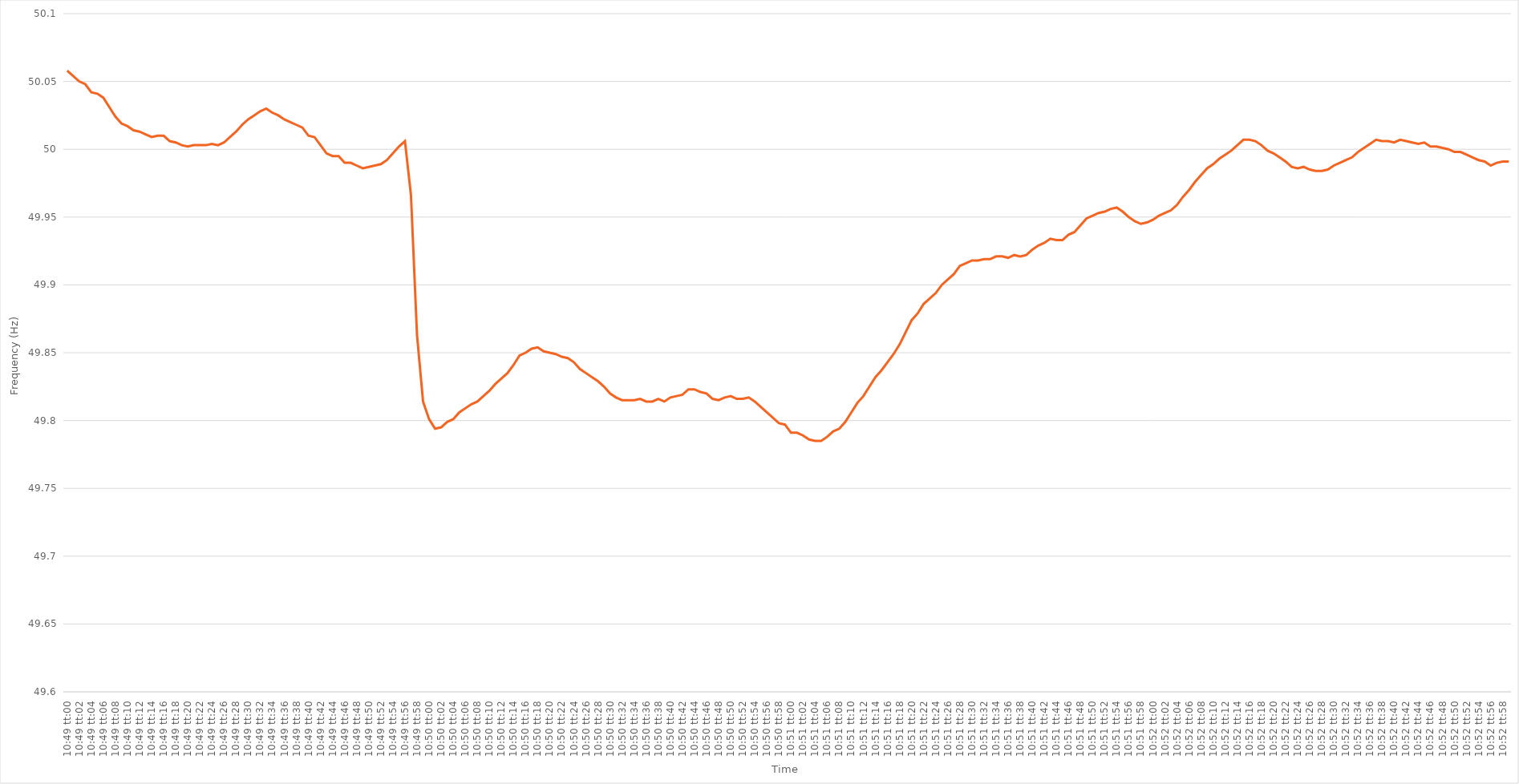
| Category | Series 0 |
|---|---|
| 0.45069444444444445 | 50.058 |
| 0.45070601851851855 | 50.054 |
| 0.4507175925925926 | 50.05 |
| 0.4507291666666667 | 50.048 |
| 0.4507407407407407 | 50.042 |
| 0.45075231481481487 | 50.041 |
| 0.4507638888888889 | 50.038 |
| 0.45077546296296295 | 50.031 |
| 0.45078703703703704 | 50.024 |
| 0.4507986111111111 | 50.019 |
| 0.4508101851851852 | 50.017 |
| 0.4508217592592592 | 50.014 |
| 0.45083333333333336 | 50.013 |
| 0.4508449074074074 | 50.011 |
| 0.4508564814814815 | 50.009 |
| 0.45086805555555554 | 50.01 |
| 0.45087962962962963 | 50.01 |
| 0.45089120370370367 | 50.006 |
| 0.4509027777777778 | 50.005 |
| 0.45091435185185186 | 50.003 |
| 0.45092592592592595 | 50.002 |
| 0.4509375 | 50.003 |
| 0.4509490740740741 | 50.003 |
| 0.4509606481481481 | 50.003 |
| 0.4509722222222223 | 50.004 |
| 0.4509837962962963 | 50.003 |
| 0.45099537037037035 | 50.005 |
| 0.45100694444444445 | 50.009 |
| 0.4510185185185185 | 50.013 |
| 0.4510300925925926 | 50.018 |
| 0.4510416666666666 | 50.022 |
| 0.45105324074074077 | 50.025 |
| 0.4510648148148148 | 50.028 |
| 0.4510763888888889 | 50.03 |
| 0.45108796296296294 | 50.027 |
| 0.45109953703703703 | 50.025 |
| 0.4511111111111111 | 50.022 |
| 0.4511226851851852 | 50.02 |
| 0.45113425925925926 | 50.018 |
| 0.45114583333333336 | 50.016 |
| 0.4511574074074074 | 50.01 |
| 0.4511689814814815 | 50.009 |
| 0.45118055555555553 | 50.003 |
| 0.4511921296296297 | 49.997 |
| 0.4512037037037037 | 49.995 |
| 0.4512152777777778 | 49.995 |
| 0.45122685185185185 | 49.99 |
| 0.4512384259259259 | 49.99 |
| 0.45125 | 49.988 |
| 0.451261574074074 | 49.986 |
| 0.4512731481481482 | 49.987 |
| 0.4512847222222222 | 49.988 |
| 0.4512962962962963 | 49.989 |
| 0.45130787037037035 | 49.992 |
| 0.45131944444444444 | 49.997 |
| 0.4513310185185185 | 50.002 |
| 0.45134259259259263 | 50.006 |
| 0.45135416666666667 | 49.966 |
| 0.45136574074074076 | 49.863 |
| 0.4513773148148148 | 49.814 |
| 0.4513888888888889 | 49.801 |
| 0.45140046296296293 | 49.794 |
| 0.4514120370370371 | 49.795 |
| 0.4514236111111111 | 49.799 |
| 0.4514351851851852 | 49.801 |
| 0.45144675925925926 | 49.806 |
| 0.45145833333333335 | 49.809 |
| 0.4514699074074074 | 49.812 |
| 0.45148148148148143 | 49.814 |
| 0.4514930555555556 | 49.818 |
| 0.4515046296296296 | 49.822 |
| 0.4515162037037037 | 49.827 |
| 0.45152777777777775 | 49.831 |
| 0.45153935185185184 | 49.835 |
| 0.4515509259259259 | 49.841 |
| 0.45156250000000003 | 49.848 |
| 0.45157407407407407 | 49.85 |
| 0.45158564814814817 | 49.853 |
| 0.4515972222222222 | 49.854 |
| 0.4516087962962963 | 49.851 |
| 0.45162037037037034 | 49.85 |
| 0.4516319444444445 | 49.849 |
| 0.4516435185185185 | 49.847 |
| 0.4516550925925926 | 49.846 |
| 0.45166666666666666 | 49.843 |
| 0.45167824074074076 | 49.838 |
| 0.4516898148148148 | 49.835 |
| 0.45170138888888894 | 49.832 |
| 0.451712962962963 | 49.829 |
| 0.451724537037037 | 49.825 |
| 0.4517361111111111 | 49.82 |
| 0.45174768518518515 | 49.817 |
| 0.45175925925925925 | 49.815 |
| 0.4517708333333333 | 49.815 |
| 0.45178240740740744 | 49.815 |
| 0.4517939814814815 | 49.816 |
| 0.45180555555555557 | 49.814 |
| 0.4518171296296296 | 49.814 |
| 0.4518287037037037 | 49.816 |
| 0.45184027777777774 | 49.814 |
| 0.4518518518518519 | 49.817 |
| 0.45186342592592593 | 49.818 |
| 0.451875 | 49.819 |
| 0.45188657407407407 | 49.823 |
| 0.45189814814814816 | 49.823 |
| 0.4519097222222222 | 49.821 |
| 0.45192129629629635 | 49.82 |
| 0.4519328703703704 | 49.816 |
| 0.4519444444444444 | 49.815 |
| 0.4519560185185185 | 49.817 |
| 0.45196759259259256 | 49.818 |
| 0.45197916666666665 | 49.816 |
| 0.4519907407407407 | 49.816 |
| 0.45200231481481484 | 49.817 |
| 0.4520138888888889 | 49.814 |
| 0.452025462962963 | 49.81 |
| 0.452037037037037 | 49.806 |
| 0.4520486111111111 | 49.802 |
| 0.45206018518518515 | 49.798 |
| 0.4520717592592593 | 49.797 |
| 0.45208333333333334 | 49.791 |
| 0.45209490740740743 | 49.791 |
| 0.45210648148148147 | 49.789 |
| 0.45211805555555556 | 49.786 |
| 0.4521296296296296 | 49.785 |
| 0.45214120370370375 | 49.785 |
| 0.4521527777777778 | 49.788 |
| 0.4521643518518519 | 49.792 |
| 0.4521759259259259 | 49.794 |
| 0.45218749999999996 | 49.799 |
| 0.45219907407407406 | 49.806 |
| 0.4522106481481481 | 49.813 |
| 0.45222222222222225 | 49.818 |
| 0.4522337962962963 | 49.825 |
| 0.4522453703703704 | 49.832 |
| 0.4522569444444444 | 49.837 |
| 0.4522685185185185 | 49.843 |
| 0.45228009259259255 | 49.849 |
| 0.4522916666666667 | 49.856 |
| 0.45230324074074074 | 49.865 |
| 0.45231481481481484 | 49.874 |
| 0.4523263888888889 | 49.879 |
| 0.45233796296296297 | 49.886 |
| 0.452349537037037 | 49.89 |
| 0.45236111111111116 | 49.894 |
| 0.4523726851851852 | 49.9 |
| 0.4523842592592593 | 49.904 |
| 0.45239583333333333 | 49.908 |
| 0.4524074074074074 | 49.914 |
| 0.45241898148148146 | 49.916 |
| 0.4524305555555555 | 49.918 |
| 0.45244212962962965 | 49.918 |
| 0.4524537037037037 | 49.919 |
| 0.4524652777777778 | 49.919 |
| 0.4524768518518518 | 49.921 |
| 0.4524884259259259 | 49.921 |
| 0.45249999999999996 | 49.92 |
| 0.4525115740740741 | 49.922 |
| 0.45252314814814815 | 49.921 |
| 0.45253472222222224 | 49.922 |
| 0.4525462962962963 | 49.926 |
| 0.4525578703703704 | 49.929 |
| 0.4525694444444444 | 49.931 |
| 0.45258101851851856 | 49.934 |
| 0.4525925925925926 | 49.933 |
| 0.4526041666666667 | 49.933 |
| 0.45261574074074074 | 49.937 |
| 0.45262731481481483 | 49.939 |
| 0.45263888888888887 | 49.944 |
| 0.452650462962963 | 49.949 |
| 0.45266203703703706 | 49.951 |
| 0.4526736111111111 | 49.953 |
| 0.4526851851851852 | 49.954 |
| 0.45269675925925923 | 49.956 |
| 0.4527083333333333 | 49.957 |
| 0.45271990740740736 | 49.954 |
| 0.4527314814814815 | 49.95 |
| 0.45274305555555555 | 49.947 |
| 0.45275462962962965 | 49.945 |
| 0.4527662037037037 | 49.946 |
| 0.4527777777777778 | 49.948 |
| 0.4527893518518518 | 49.951 |
| 0.45280092592592597 | 49.953 |
| 0.4528125 | 49.955 |
| 0.4528240740740741 | 49.959 |
| 0.45283564814814814 | 49.965 |
| 0.45284722222222223 | 49.97 |
| 0.4528587962962963 | 49.976 |
| 0.4528703703703704 | 49.981 |
| 0.45288194444444446 | 49.986 |
| 0.4528935185185185 | 49.989 |
| 0.4529050925925926 | 49.993 |
| 0.45291666666666663 | 49.996 |
| 0.45292824074074073 | 49.999 |
| 0.45293981481481477 | 50.003 |
| 0.4529513888888889 | 50.007 |
| 0.45296296296296296 | 50.007 |
| 0.45297453703703705 | 50.006 |
| 0.4529861111111111 | 50.003 |
| 0.4529976851851852 | 49.999 |
| 0.4530092592592592 | 49.997 |
| 0.4530208333333334 | 49.994 |
| 0.4530324074074074 | 49.991 |
| 0.4530439814814815 | 49.987 |
| 0.45305555555555554 | 49.986 |
| 0.45306712962962964 | 49.987 |
| 0.4530787037037037 | 49.985 |
| 0.45309027777777783 | 49.984 |
| 0.45310185185185187 | 49.984 |
| 0.45311342592592596 | 49.985 |
| 0.453125 | 49.988 |
| 0.45313657407407404 | 49.99 |
| 0.45314814814814813 | 49.992 |
| 0.45315972222222217 | 49.994 |
| 0.4531712962962963 | 49.998 |
| 0.45318287037037036 | 50.001 |
| 0.45319444444444446 | 50.004 |
| 0.4532060185185185 | 50.007 |
| 0.4532175925925926 | 50.006 |
| 0.4532291666666666 | 50.006 |
| 0.4532407407407408 | 50.005 |
| 0.4532523148148148 | 50.007 |
| 0.4532638888888889 | 50.006 |
| 0.45327546296296295 | 50.005 |
| 0.45328703703703704 | 50.004 |
| 0.4532986111111111 | 50.005 |
| 0.45331018518518523 | 50.002 |
| 0.45332175925925927 | 50.002 |
| 0.45333333333333337 | 50.001 |
| 0.4533449074074074 | 50 |
| 0.4533564814814815 | 49.998 |
| 0.45336805555555554 | 49.998 |
| 0.4533796296296296 | 49.996 |
| 0.4533912037037037 | 49.994 |
| 0.45340277777777777 | 49.992 |
| 0.45341435185185186 | 49.991 |
| 0.4534259259259259 | 49.988 |
| 0.4534375 | 49.99 |
| 0.45344907407407403 | 49.991 |
| 0.4534606481481482 | 49.991 |